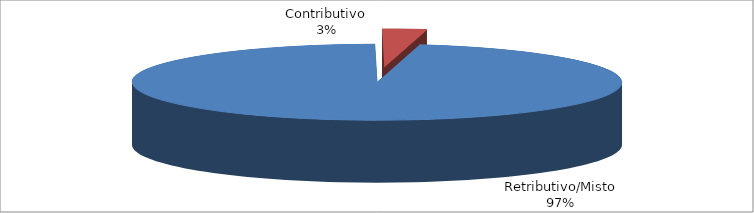
| Category | Series 1 |
|---|---|
| Retributivo/Misto | 20929 |
| Contributivo | 631 |